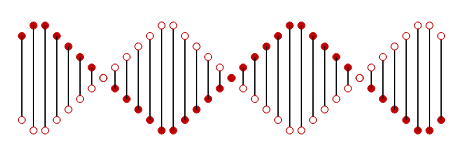
| Category | Solid | Hollow |
|---|---|---|
| 0 | 20 | -20 |
| 1 | 25 | -25 |
| 2 | 25 | -25 |
| 3 | 20 | -20 |
| 4 | 15 | -15 |
| 5 | 10 | -10 |
| 6 | 5 | -5 |
| 7 | 0 | 0 |
| 8 | -5 | 5 |
| 9 | -10 | 10 |
| 10 | -15 | 15 |
| 11 | -20 | 20 |
| 12 | -25 | 25 |
| 13 | -25 | 25 |
| 14 | -20 | 20 |
| 15 | -15 | 15 |
| 16 | -10 | 10 |
| 17 | -5 | 5 |
| 18 | 0 | 0 |
| 19 | 5 | -5 |
| 20 | 10 | -10 |
| 21 | 15 | -15 |
| 22 | 20 | -20 |
| 23 | 25 | -25 |
| 24 | 25 | -25 |
| 25 | 20 | -20 |
| 26 | 15 | -15 |
| 27 | 10 | -10 |
| 28 | 5 | -5 |
| 29 | 0 | 0 |
| 30 | -5 | 5 |
| 31 | -10 | 10 |
| 32 | -15 | 15 |
| 33 | -20 | 20 |
| 34 | -25 | 25 |
| 35 | -25 | 25 |
| 36 | -20 | 20 |